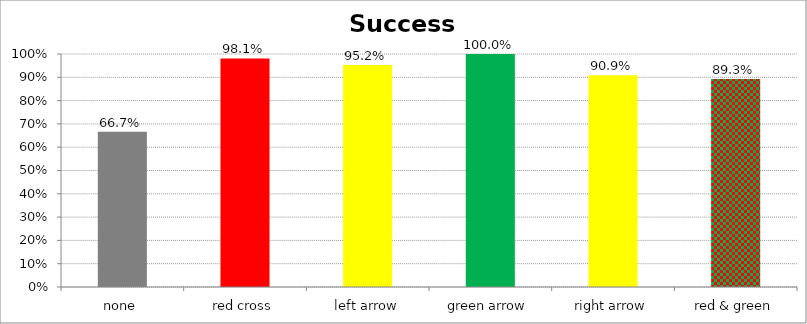
| Category | Success Rate |
|---|---|
| none | 0.667 |
| red cross | 0.981 |
| left arrow | 0.952 |
| green arrow | 1 |
| right arrow | 0.909 |
| red & green | 0.893 |